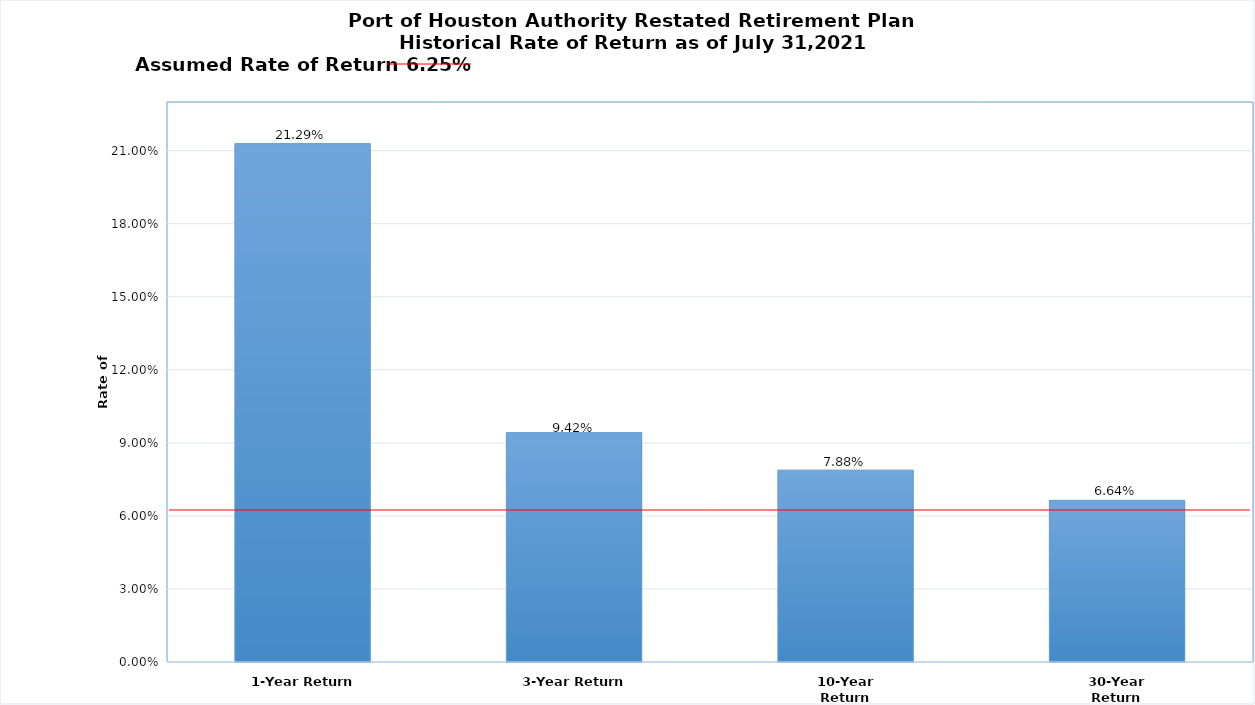
| Category | Series 0 |
|---|---|
| 1-Year Return | 0.213 |
| 3-Year Return | 0.094 |
| 10-Year Return | 0.079 |
| 30-Year Return | 0.066 |